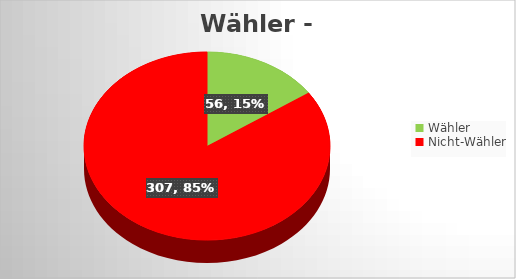
| Category | Series 0 |
|---|---|
| Wähler | 56 |
| Nicht-Wähler | 307 |